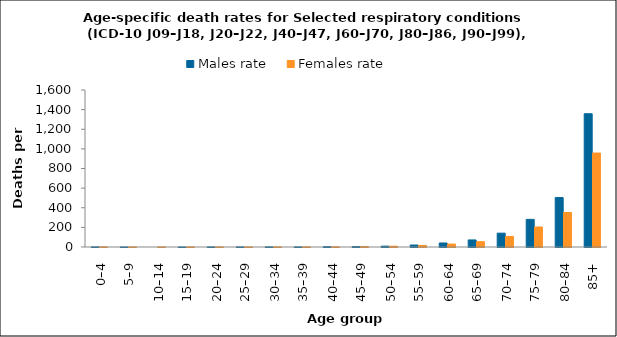
| Category | Males rate | Females rate |
|---|---|---|
| 0–4 | 1.159 | 0.818 |
| 5–9 | 0.241 | 0.382 |
| 10–14 | 0 | 0.127 |
| 15–19 | 0.262 | 0.557 |
| 20–24 | 0.478 | 0.254 |
| 25–29 | 0.653 | 0.332 |
| 30–34 | 1.17 | 0.834 |
| 35–39 | 0.754 | 1.065 |
| 40–44 | 3.064 | 1.312 |
| 45–49 | 4.405 | 4.443 |
| 50–54 | 8.688 | 8.074 |
| 55–59 | 20.065 | 16.498 |
| 60–64 | 40.917 | 29.98 |
| 65–69 | 71.899 | 53.727 |
| 70–74 | 140.799 | 108.262 |
| 75–79 | 281.558 | 203.886 |
| 80–84 | 503.677 | 350.995 |
| 85+ | 1358.127 | 957.771 |